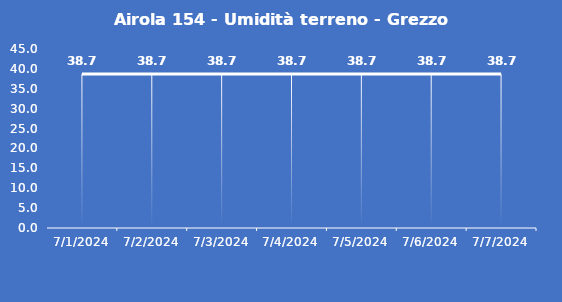
| Category | Airola 154 - Umidità terreno - Grezzo (%VWC) |
|---|---|
| 7/1/24 | 38.7 |
| 7/2/24 | 38.7 |
| 7/3/24 | 38.7 |
| 7/4/24 | 38.7 |
| 7/5/24 | 38.7 |
| 7/6/24 | 38.7 |
| 7/7/24 | 38.7 |